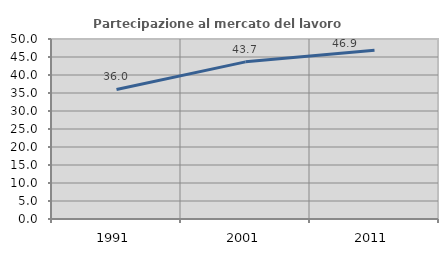
| Category | Partecipazione al mercato del lavoro  femminile |
|---|---|
| 1991.0 | 35.989 |
| 2001.0 | 43.652 |
| 2011.0 | 46.88 |